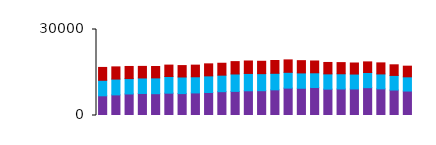
| Category | North |
|---|---|
| 0 | 4484 |
| 1 | 4250 |
| 2 | 4223 |
| 3 | 4038 |
| 4 | 3970 |
| 5 | 3977 |
| 6 | 3983 |
| 7 | 4060 |
| 8 | 4195 |
| 9 | 4162 |
| 10 | 4310 |
| 11 | 4350 |
| 12 | 4325 |
| 13 | 4475 |
| 14 | 4334 |
| 15 | 4277 |
| 16 | 4122 |
| 17 | 3977 |
| 18 | 3889 |
| 19 | 3854 |
| 20 | 3709 |
| 21 | 3850 |
| 22 | 3705 |
| 23 | 3720 |